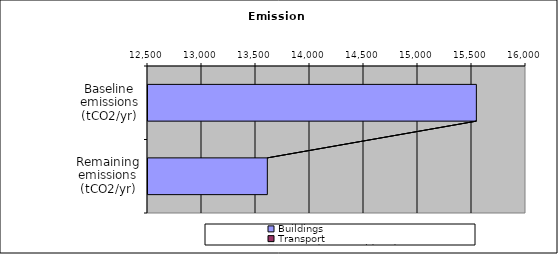
| Category | Buildings | Transport | Demand not considered  |
|---|---|---|---|
| Baseline emissions (tCO2/yr) | 15549.687 | 0 | 0 |
| Remaining emissions (tCO2/yr) | 13614.251 | 0 | 0 |